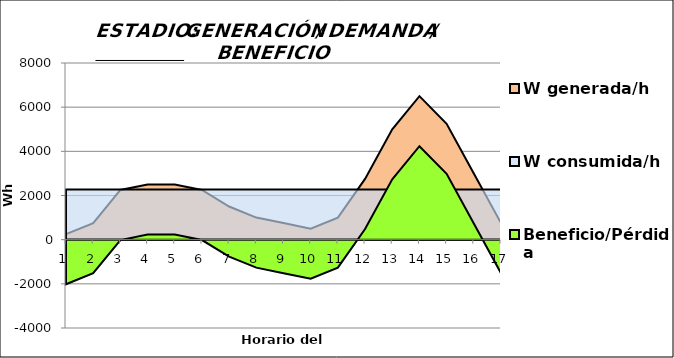
| Category | W generada/h | W consumida/h | Beneficio/Pérdida |
|---|---|---|---|
| 0 | 250 | 2267.438 | -2017.438 |
| 1 | 750 | 2267.438 | -1517.438 |
| 2 | 2250 | 2267.438 | -17.438 |
| 3 | 2500 | 2267.438 | 232.562 |
| 4 | 2500 | 2267.438 | 232.562 |
| 5 | 2250 | 2267.438 | -17.438 |
| 6 | 1500 | 2267.438 | -767.438 |
| 7 | 1000 | 2267.438 | -1267.438 |
| 8 | 750 | 2267.438 | -1517.438 |
| 9 | 500 | 2267.438 | -1767.438 |
| 10 | 1000 | 2267.438 | -1267.438 |
| 11 | 2750 | 2267.438 | 482.562 |
| 12 | 5000 | 2267.438 | 2732.562 |
| 13 | 6500 | 2267.438 | 4232.562 |
| 14 | 5250 | 2267.438 | 2982.562 |
| 15 | 3000 | 2267.438 | 732.562 |
| 16 | 750 | 2267.438 | -1517.438 |